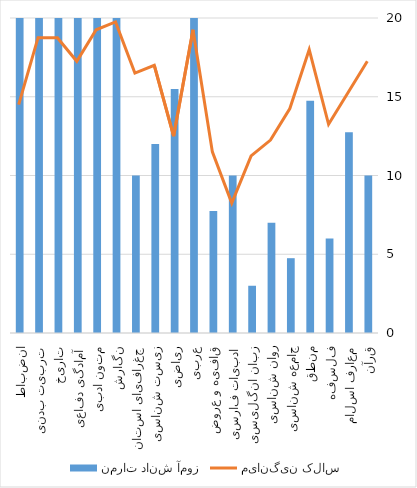
| Category | نمرات دانش آموز |
|---|---|
| قرآن | 10 |
| معارف اسلامی | 12.75 |
| فلسفه | 6 |
| منطق | 14.75 |
| جامعه شناسی | 4.75 |
| روان شناسی | 7 |
| زبان انگلیسی | 3 |
| ادبیات فارسی | 10 |
| قافیه و عروض | 7.75 |
| عربی | 20 |
| ریاضی | 15.5 |
| زیست شناسی | 12 |
| جغرافیای استان | 10 |
| نگارش | 20 |
| متون ادبی | 20 |
| آمادگی دفاعی | 20 |
| تاریخ | 20 |
| تربیت بدنی | 20 |
| انضباط | 20 |